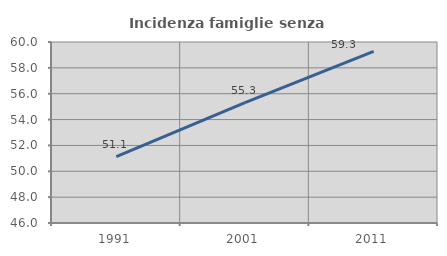
| Category | Incidenza famiglie senza nuclei |
|---|---|
| 1991.0 | 51.133 |
| 2001.0 | 55.303 |
| 2011.0 | 59.274 |